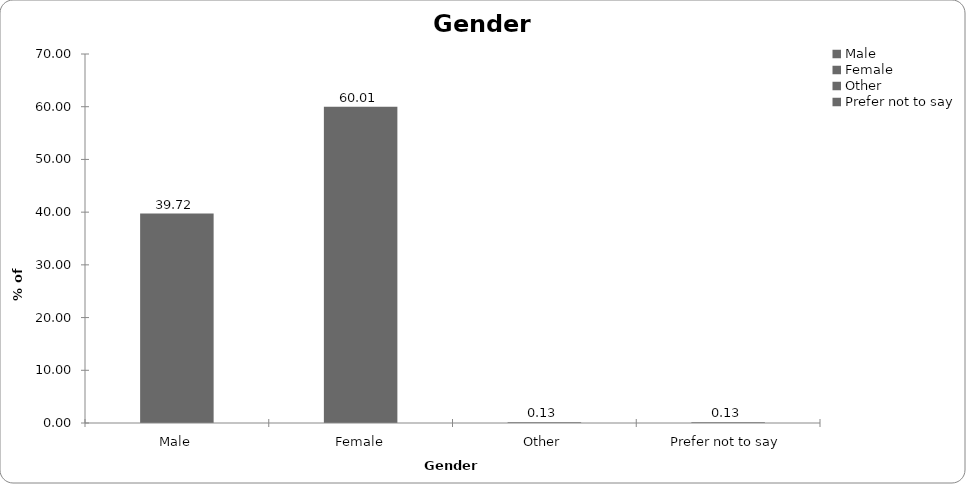
| Category | Series 0 |
|---|---|
| Male | 39.72 |
| Female | 60.013 |
| Other | 0.134 |
| Prefer not to say | 0.134 |